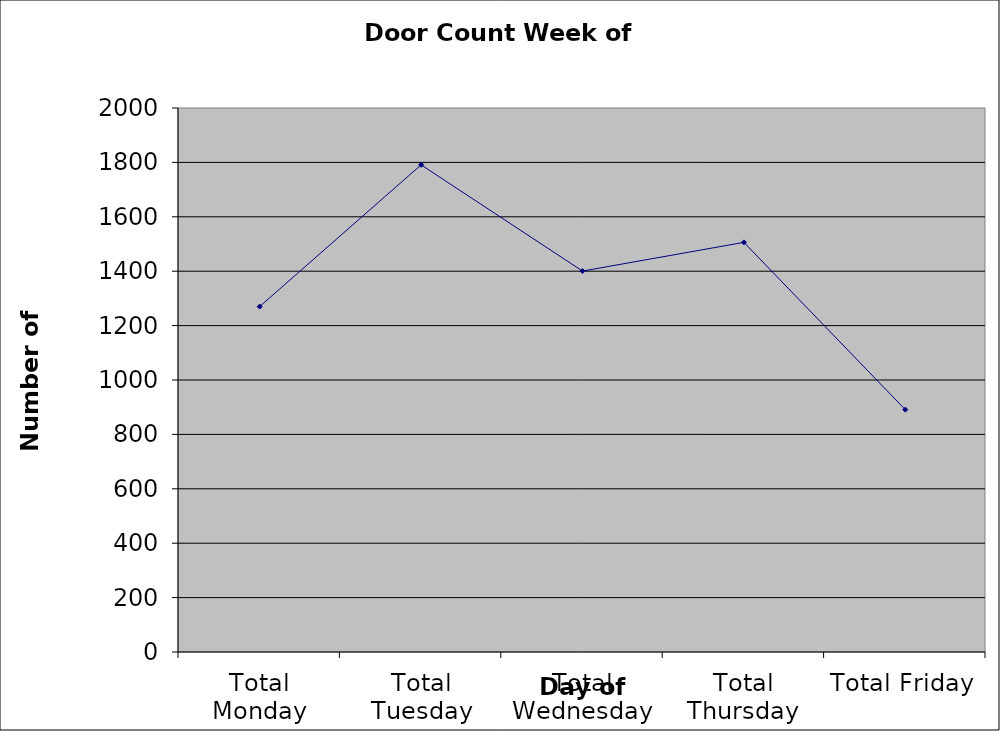
| Category | Series 0 |
|---|---|
| Total Monday | 1270 |
| Total Tuesday | 1791 |
| Total Wednesday | 1400.5 |
| Total Thursday | 1506 |
| Total Friday | 891 |